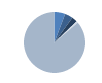
| Category | Series 0 |
|---|---|
| 0 | 72 |
| 1 | 53 |
| 2 | 37 |
| 3 | 11 |
| 4 | 1086 |